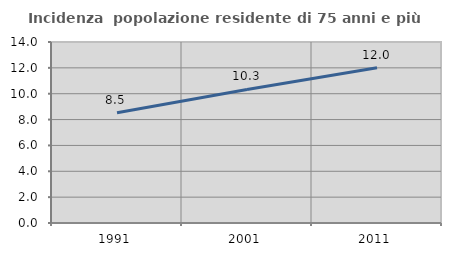
| Category | Incidenza  popolazione residente di 75 anni e più |
|---|---|
| 1991.0 | 8.529 |
| 2001.0 | 10.332 |
| 2011.0 | 12.005 |